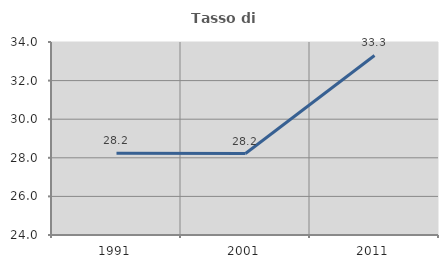
| Category | Tasso di occupazione   |
|---|---|
| 1991.0 | 28.233 |
| 2001.0 | 28.221 |
| 2011.0 | 33.302 |